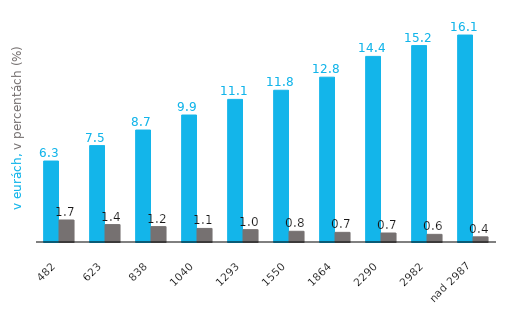
| Category | Series 0 | Series 1 |
|---|---|---|
| 482 | 6.281 | 1.707 |
| 623 | 7.478 | 1.351 |
| 838 | 8.687 | 1.193 |
| 1040 | 9.851 | 1.052 |
| 1293 | 11.066 | 0.958 |
| 1550 | 11.773 | 0.831 |
| 1864 | 12.786 | 0.748 |
| 2290 | 14.4 | 0.698 |
| 2982 | 15.238 | 0.593 |
| nad 2987 | 16.057 | 0.4 |